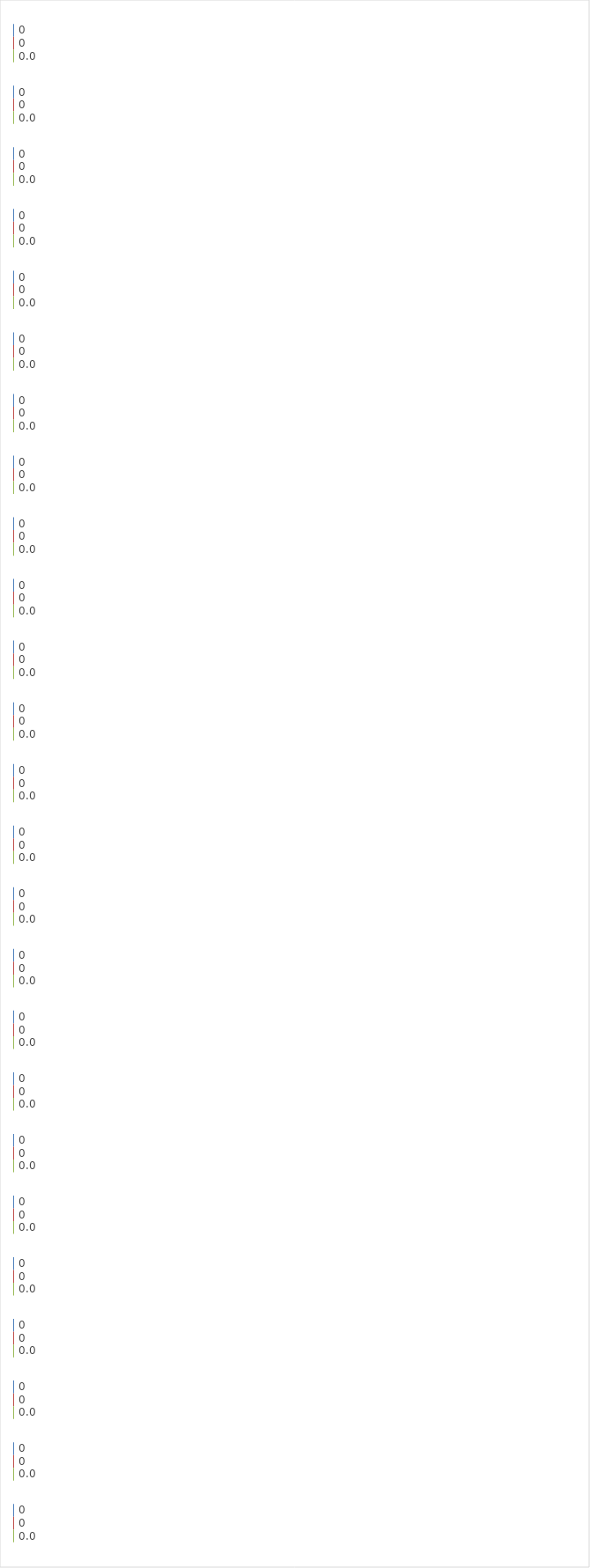
| Category | Selbstreflexion LK | Beobachter | Ergebnis SuS |
|---|---|---|---|
| 0 | 0 | 0 | 0 |
| 1 | 0 | 0 | 0 |
| 2 | 0 | 0 | 0 |
| 3 | 0 | 0 | 0 |
| 4 | 0 | 0 | 0 |
| 5 | 0 | 0 | 0 |
| 6 | 0 | 0 | 0 |
| 7 | 0 | 0 | 0 |
| 8 | 0 | 0 | 0 |
| 9 | 0 | 0 | 0 |
| 10 | 0 | 0 | 0 |
| 11 | 0 | 0 | 0 |
| 12 | 0 | 0 | 0 |
| 13 | 0 | 0 | 0 |
| 14 | 0 | 0 | 0 |
| 15 | 0 | 0 | 0 |
| 16 | 0 | 0 | 0 |
| 17 | 0 | 0 | 0 |
| 18 | 0 | 0 | 0 |
| 19 | 0 | 0 | 0 |
| 20 | 0 | 0 | 0 |
| 21 | 0 | 0 | 0 |
| 22 | 0 | 0 | 0 |
| 23 | 0 | 0 | 0 |
| 24 | 0 | 0 | 0 |